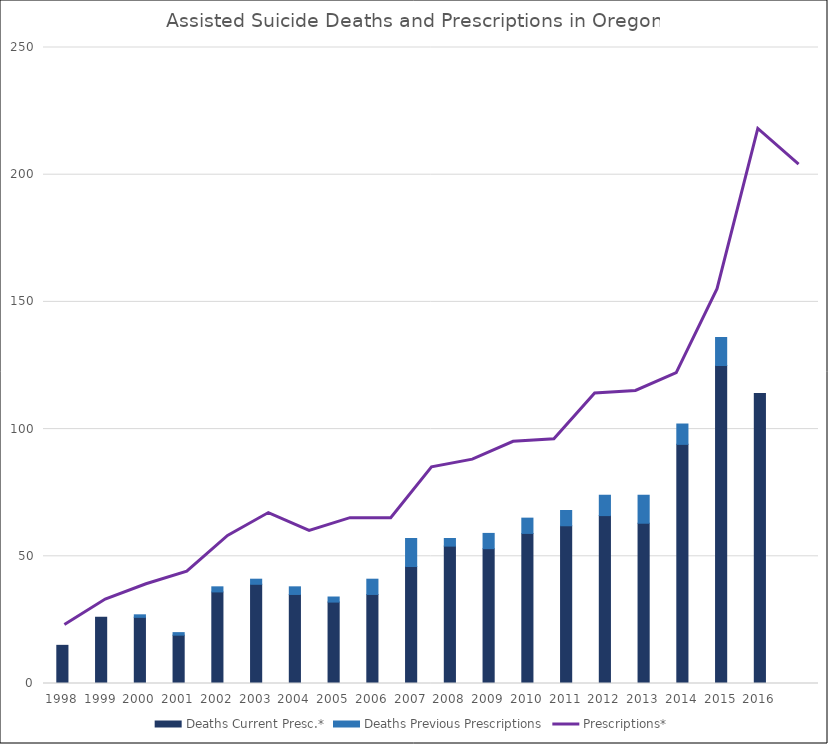
| Category | Deaths Current Presc.* | Deaths Previous Prescriptions |
|---|---|---|
| 1998 | 15 | 0 |
| 1999 | 26 | 0 |
| 2000 | 26 | 1 |
| 2001 | 19 | 1 |
| 2002 | 36 | 2 |
| 2003 | 39 | 2 |
| 2004 | 35 | 3 |
| 2005 | 32 | 2 |
| 2006 | 35 | 6 |
| 2007 | 46 | 11 |
| 2008 | 54 | 3 |
| 2009 | 53 | 6 |
| 2010 | 59 | 6 |
| 2011 | 62 | 6 |
| 2012 | 66 | 8 |
| 2013 | 63 | 11 |
| 2014 | 94 | 8 |
| 2015 | 125 | 11 |
| 2016 | 114 | 0 |